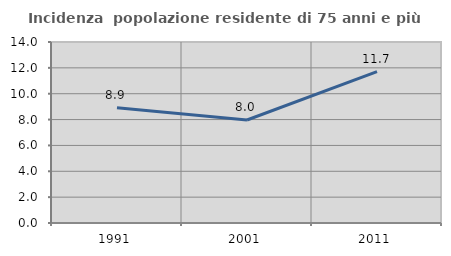
| Category | Incidenza  popolazione residente di 75 anni e più |
|---|---|
| 1991.0 | 8.914 |
| 2001.0 | 7.966 |
| 2011.0 | 11.712 |